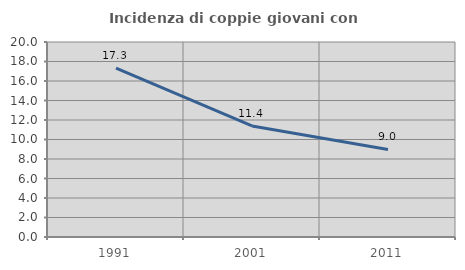
| Category | Incidenza di coppie giovani con figli |
|---|---|
| 1991.0 | 17.322 |
| 2001.0 | 11.392 |
| 2011.0 | 8.981 |